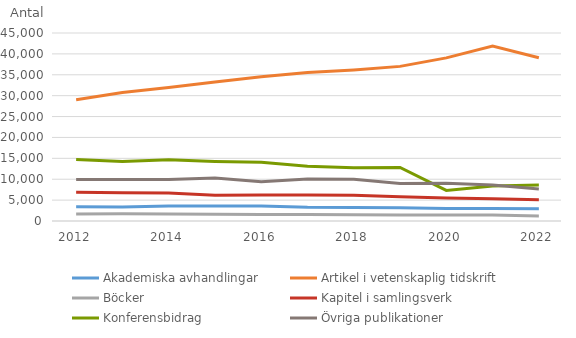
| Category | Akademiska avhandlingar | Artikel i vetenskaplig tidskrift | Böcker | Kapitel i samlingsverk | Konferensbidrag | Övriga publikationer |
|---|---|---|---|---|---|---|
| 2012 | 3391 | 29046 | 1648 | 6873 | 14699 | 9917 |
| 2013 | 3356 | 30776 | 1722 | 6749 | 14230 | 9958 |
| 2014 | 3584 | 31951 | 1678 | 6723 | 14659 | 9910 |
| 2015 | 3561 | 33279 | 1603 | 6187 | 14266 | 10315 |
| 2016 | 3590 | 34545 | 1555 | 6221 | 14039 | 9408 |
| 2017 | 3267 | 35561 | 1543 | 6247 | 13128 | 10034 |
| 2018 | 3202 | 36166 | 1514 | 6187 | 12755 | 9984 |
| 2019 | 3166 | 37009 | 1433 | 5827 | 12805 | 8983 |
| 2020 | 2990 | 39049 | 1412 | 5512 | 7320 | 9048 |
| 2021 | 3005 | 41881 | 1449 | 5353 | 8359 | 8616 |
| 2022 | 2945 | 39093 | 1216 | 5111 | 8605 | 7659 |